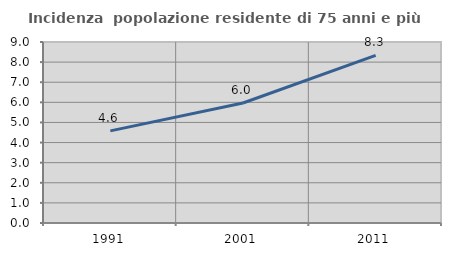
| Category | Incidenza  popolazione residente di 75 anni e più |
|---|---|
| 1991.0 | 4.579 |
| 2001.0 | 5.967 |
| 2011.0 | 8.335 |